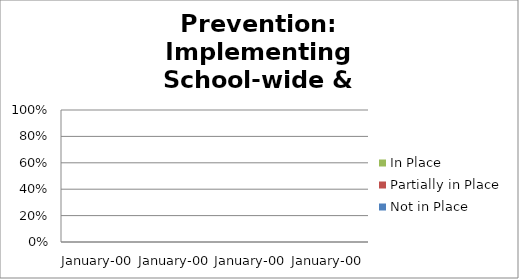
| Category | Not in Place | Partially in Place | In Place |
|---|---|---|---|
| 0.0 | 0 | 0 | 0 |
| 0.0 | 0 | 0 | 0 |
| 0.0 | 0 | 0 | 0 |
| 0.0 | 0 | 0 | 0 |